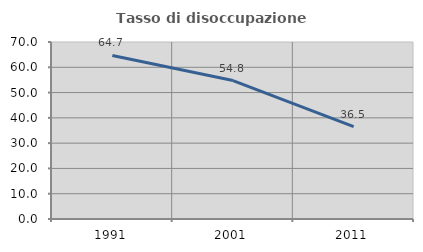
| Category | Tasso di disoccupazione giovanile  |
|---|---|
| 1991.0 | 64.674 |
| 2001.0 | 54.762 |
| 2011.0 | 36.538 |